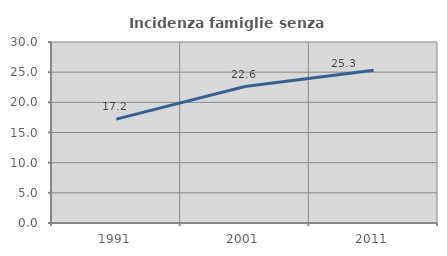
| Category | Incidenza famiglie senza nuclei |
|---|---|
| 1991.0 | 17.213 |
| 2001.0 | 22.624 |
| 2011.0 | 25.304 |